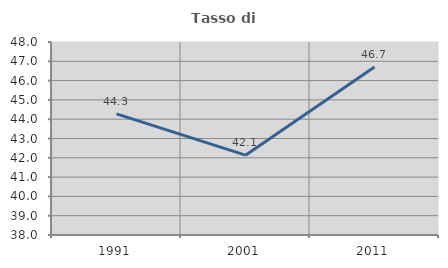
| Category | Tasso di occupazione   |
|---|---|
| 1991.0 | 44.273 |
| 2001.0 | 42.135 |
| 2011.0 | 46.704 |